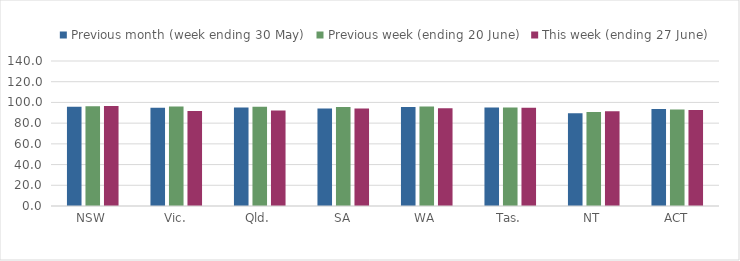
| Category | Previous month (week ending 30 May) | Previous week (ending 20 June) | This week (ending 27 June) |
|---|---|---|---|
| NSW | 95.92 | 96.369 | 96.587 |
| Vic. | 94.828 | 96.168 | 91.753 |
| Qld. | 95.218 | 95.712 | 92.137 |
| SA | 94.168 | 95.689 | 94.082 |
| WA | 95.657 | 96.176 | 94.295 |
| Tas. | 94.99 | 95.187 | 94.868 |
| NT | 89.543 | 90.746 | 91.492 |
| ACT | 93.732 | 93.171 | 92.657 |